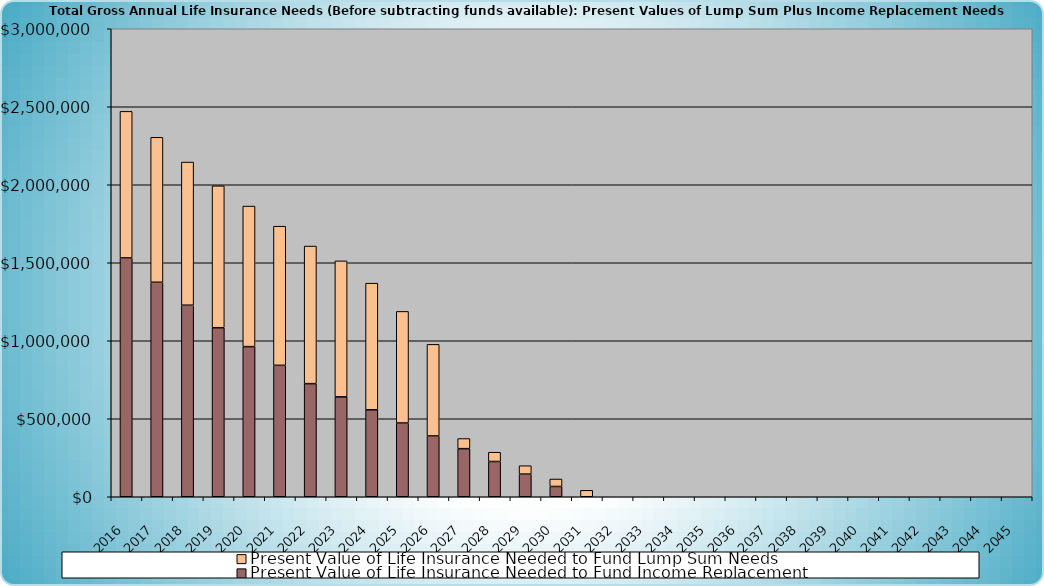
| Category | Present Value of Life Insurance Needed to Fund Income Replacement | Present Value of Life Insurance Needed to Fund Lump Sum Needs |
|---|---|---|
| 2016.0 | 1530932.629 | 939583.285 |
| 2017.0 | 1374932.629 | 929200.585 |
| 2018.0 | 1227817.244 | 917685.33 |
| 2019.0 | 1083531.001 | 909621.246 |
| 2020.0 | 962254.829 | 901018.512 |
| 2021.0 | 842484.52 | 891841.082 |
| 2022.0 | 725017.486 | 882050.492 |
| 2023.0 | 640397.128 | 871605.699 |
| 2024.0 | 557404.085 | 811715.783 |
| 2025.0 | 472777.974 | 715379.71 |
| 2026.0 | 389779.287 | 587133.604 |
| 2027.0 | 308376.73 | 64893.925 |
| 2028.0 | 225990.075 | 59521.704 |
| 2029.0 | 145187.78 | 53818.598 |
| 2030.0 | 65939.375 | 47764.327 |
| 2031.0 | 0 | 41337.371 |
| 2032.0 | 0 | 0 |
| 2033.0 | 0 | 0 |
| 2034.0 | 0 | 0 |
| 2035.0 | 0 | 0 |
| 2036.0 | 0 | 0 |
| 2037.0 | 0 | 0 |
| 2038.0 | 0 | 0 |
| 2039.0 | 0 | 0 |
| 2040.0 | 0 | 0 |
| 2041.0 | 0 | 0 |
| 2042.0 | 0 | 0 |
| 2043.0 | 0 | 0 |
| 2044.0 | 0 | 0 |
| 2045.0 | 0 | 0 |